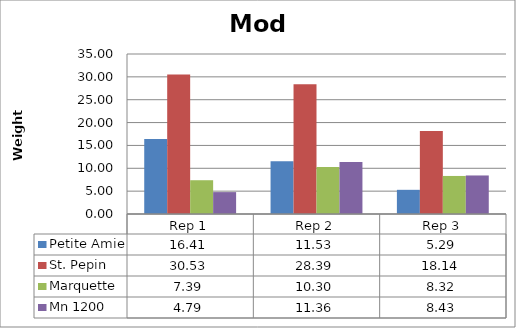
| Category | Petite Amie | St. Pepin | Marquette | Mn 1200 |
|---|---|---|---|---|
| 0 | 16.411 | 30.533 | 7.389 | 4.789 |
| 1 | 11.533 | 28.389 | 10.3 | 11.356 |
| 2 | 5.289 | 18.144 | 8.322 | 8.43 |